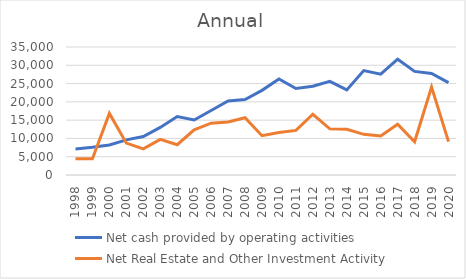
| Category | Net cash provided by operating activities | Net Real Estate and Other Investment Activity |
|---|---|---|
| 1998.0 | 7123 | 4421 |
| 1999.0 | 7580 | 4418 |
| 2000.0 | 8194 | 16846 |
| 2001.0 | 9604 | 8714 |
| 2002.0 | 10519 | 7134 |
| 2003.0 | 13005 | 9756 |
| 2004.0 | 15996 | 8287 |
| 2005.0 | 15044 | 12351 |
| 2006.0 | 17633 | 14183 |
| 2007.0 | 20235 | 14507 |
| 2008.0 | 20642 | 15670 |
| 2009.0 | 23147 | 10742 |
| 2010.0 | 26249 | 11620 |
| 2011.0 | 23643 | 12193 |
| 2012.0 | 24255 | 16609 |
| 2013.0 | 25591 | 12637 |
| 2014.0 | 23257 | 12526 |
| 2015.0 | 28564 | 11125 |
| 2016.0 | 27552 | 10675 |
| 2017.0 | 31673 | 13896 |
| 2018.0 | 28337 | 9079 |
| 2019.0 | 27753 | 24036 |
| 2020.0 | 25255 | 9128 |